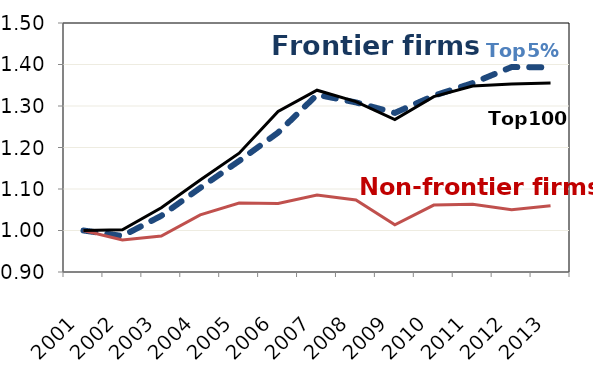
| Category | Average | Non-frontier (ORBIS) | Series 0 |
|---|---|---|---|
| 2001.0 | 1 | 1 | 1 |
| 2002.0 | 0.987 | 0.977 | 1.002 |
| 2003.0 | 1.035 | 0.987 | 1.055 |
| 2004.0 | 1.103 | 1.038 | 1.122 |
| 2005.0 | 1.168 | 1.066 | 1.186 |
| 2006.0 | 1.236 | 1.065 | 1.287 |
| 2007.0 | 1.327 | 1.085 | 1.338 |
| 2008.0 | 1.309 | 1.074 | 1.31 |
| 2009.0 | 1.283 | 1.014 | 1.267 |
| 2010.0 | 1.325 | 1.061 | 1.323 |
| 2011.0 | 1.355 | 1.063 | 1.348 |
| 2012.0 | 1.394 | 1.05 | 1.353 |
| 2013.0 | 1.393 | 1.06 | 1.356 |